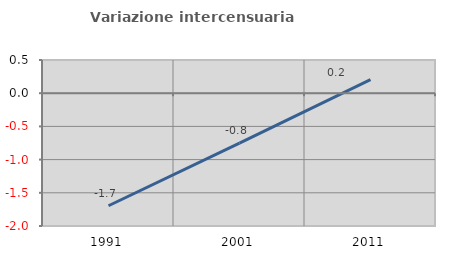
| Category | Variazione intercensuaria annua |
|---|---|
| 1991.0 | -1.695 |
| 2001.0 | -0.753 |
| 2011.0 | 0.205 |